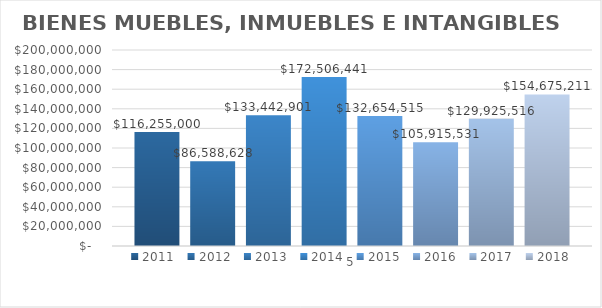
| Category | 2011 | 2012 | 2013 | 2014 | 2015 | 2016 | 2017 | 2018 |
|---|---|---|---|---|---|---|---|---|
| 0 | 116255000 | 86588628 | 133442901 | 172506441.098 | 132654515 | 105915531.43 | 129925516.39 | 154675210.63 |